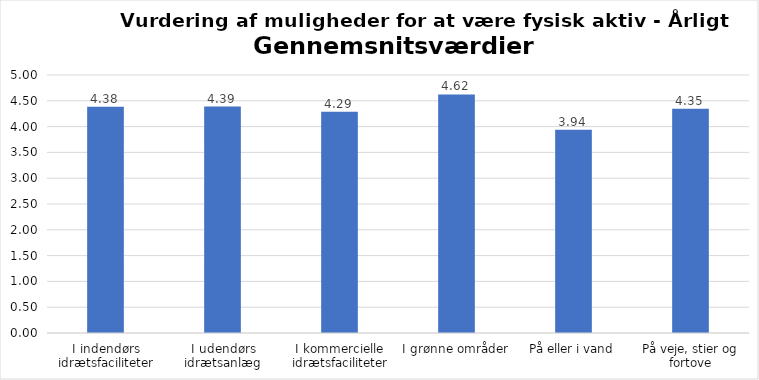
| Category | Gennemsnit |
|---|---|
| I indendørs idrætsfaciliteter | 4.383 |
| I udendørs idrætsanlæg | 4.388 |
| I kommercielle idrætsfaciliteter | 4.29 |
| I grønne områder | 4.624 |
| På eller i vand | 3.938 |
| På veje, stier og fortove | 4.347 |